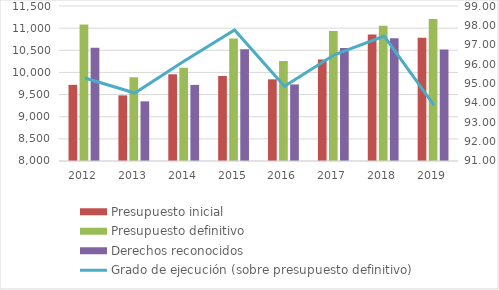
| Category | Presupuesto inicial | Presupuesto definitivo | Derechos reconocidos |
|---|---|---|---|
| 2012.0 | 9720.048 | 11079.939 | 10557.61 |
| 2013.0 | 9481.615 | 9890.285 | 9347.167 |
| 2014.0 | 9957.791 | 10105.328 | 9718.357 |
| 2015.0 | 9920.812 | 10763.44 | 10522.152 |
| 2016.0 | 9843.699 | 10256.08 | 9729.066 |
| 2017.0 | 10293.186 | 10933.955 | 10549.198 |
| 2018.0 | 10859.22 | 11055.9 | 10774.13 |
| 2019.0 | 10784.98 | 11204.58 | 10517.53 |